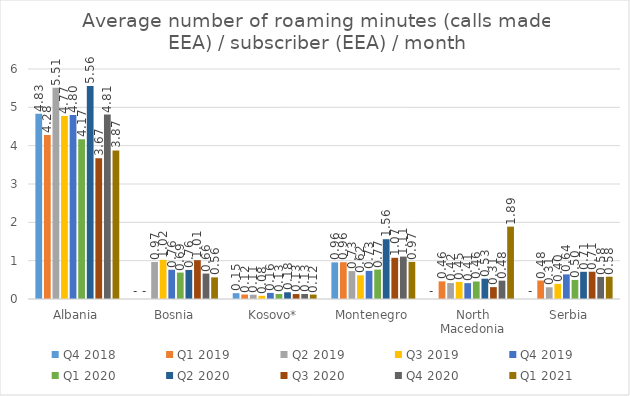
| Category | Q4 2018 | Q1 2019 | Q2 2019 | Q3 2019 | Q4 2019 | Q1 2020 | Q2 2020 | Q3 2020 | Q4 2020 | Q1 2021 |
|---|---|---|---|---|---|---|---|---|---|---|
| Albania | 4.83 | 4.277 | 5.511 | 4.771 | 4.799 | 4.167 | 5.556 | 3.673 | 4.812 | 3.875 |
| Bosnia | 0 | 0 | 0.965 | 1.021 | 0.763 | 0.689 | 0.758 | 1.013 | 0.664 | 0.564 |
| Kosovo* | 0.152 | 0.117 | 0.111 | 0.083 | 0.159 | 0.131 | 0.175 | 0.129 | 0.13 | 0.116 |
| Montenegro | 0.955 | 0.96 | 0.728 | 0.618 | 0.734 | 0.768 | 1.56 | 1.075 | 1.106 | 0.968 |
| North Macedonia | 0 | 0.46 | 0.416 | 0.446 | 0.414 | 0.457 | 0.53 | 0.31 | 0.479 | 1.888 |
| Serbia | 0 | 0.482 | 0.306 | 0.395 | 0.642 | 0.498 | 0.71 | 0.712 | 0.576 | 0.581 |